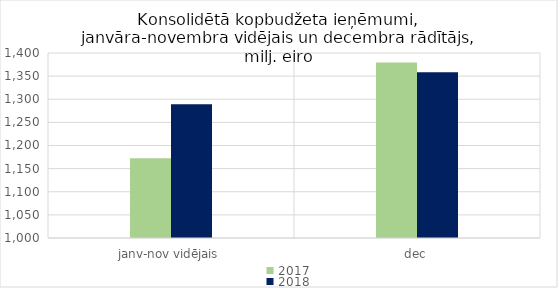
| Category | 2017 | 2018 |
|---|---|---|
| janv-nov vidējais | 1172203.675 | 1289402.252 |
| dec | 1379607.658 | 1358321.803 |